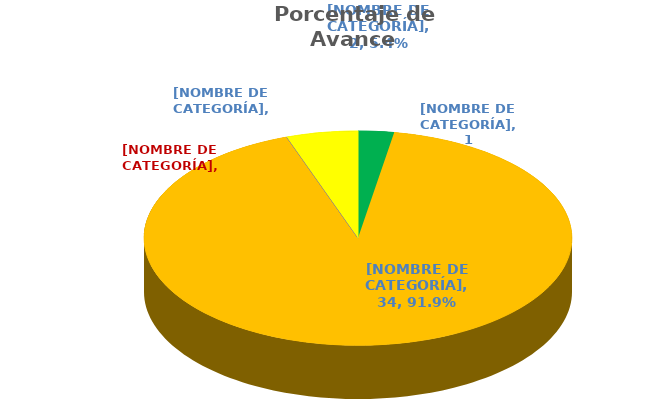
| Category | 2.7% |
|---|---|
| FINALIZADAS | 0.027 |
| EN  PROCESO | 0.919 |
| VENCIDAS CON AVANCE | 0 |
| VENCIDAS SIN AVANCE | 0 |
| NO INICIADAS | 0.054 |